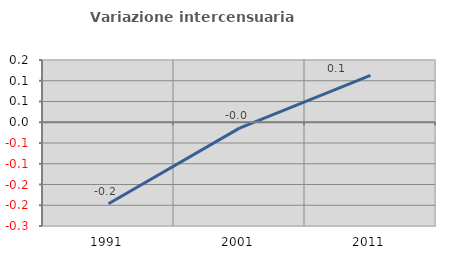
| Category | Variazione intercensuaria annua |
|---|---|
| 1991.0 | -0.196 |
| 2001.0 | -0.014 |
| 2011.0 | 0.113 |